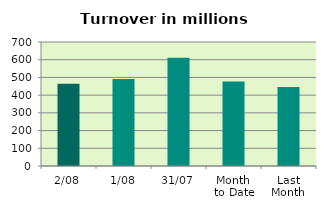
| Category | Series 0 |
|---|---|
| 2/08 | 464.213 |
| 1/08 | 491.018 |
| 31/07 | 611.286 |
| Month 
to Date | 477.615 |
| Last
Month | 446.279 |